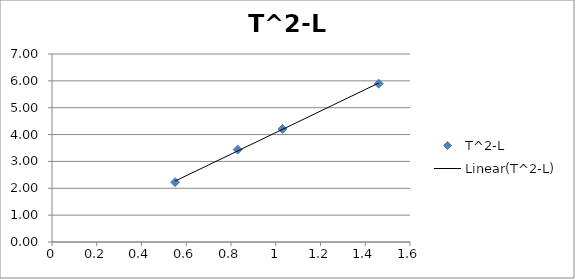
| Category | T^2-L |
|---|---|
| 0.55 | 2.226 |
| 0.83 | 3.441 |
| 1.03 | 4.207 |
| 1.46 | 5.895 |